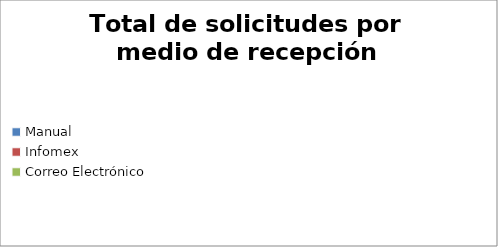
| Category | totales |
|---|---|
| Manual | 0 |
| Infomex | 0 |
| Correo Electrónico | 0 |